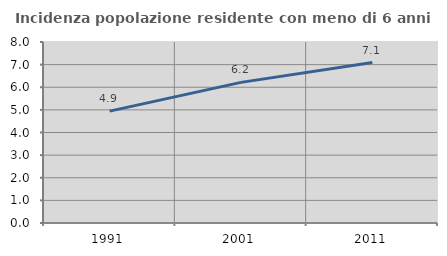
| Category | Incidenza popolazione residente con meno di 6 anni |
|---|---|
| 1991.0 | 4.946 |
| 2001.0 | 6.215 |
| 2011.0 | 7.092 |